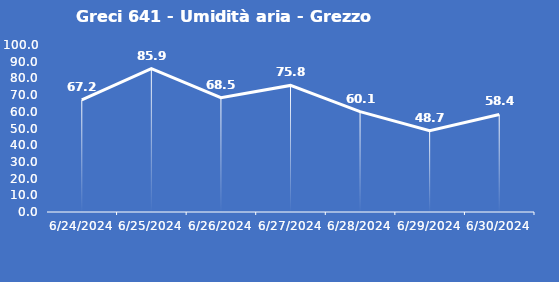
| Category | Greci 641 - Umidità aria - Grezzo (%) |
|---|---|
| 6/24/24 | 67.2 |
| 6/25/24 | 85.9 |
| 6/26/24 | 68.5 |
| 6/27/24 | 75.8 |
| 6/28/24 | 60.1 |
| 6/29/24 | 48.7 |
| 6/30/24 | 58.4 |